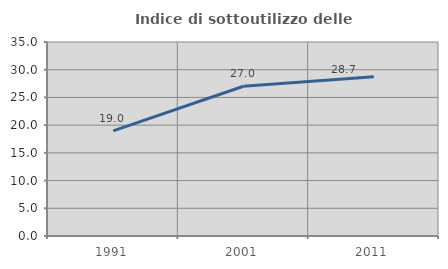
| Category | Indice di sottoutilizzo delle abitazioni  |
|---|---|
| 1991.0 | 18.975 |
| 2001.0 | 27.021 |
| 2011.0 | 28.735 |